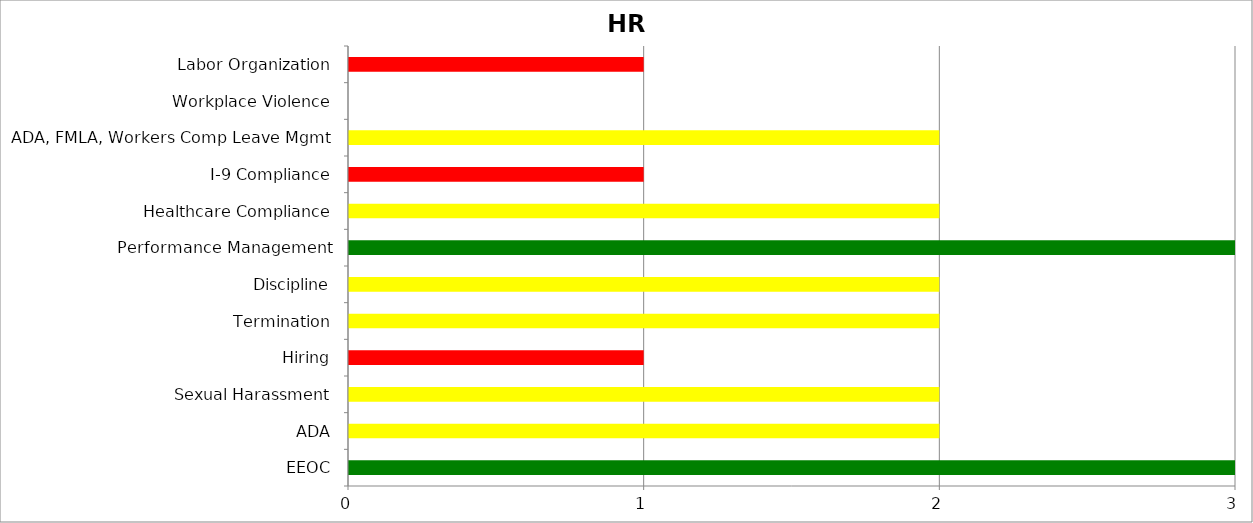
| Category | Low | Medium | High |
|---|---|---|---|
| EEOC | 3 | 0 | 0 |
| ADA | 0 | 2 | 0 |
| Sexual Harassment | 0 | 2 | 0 |
| Hiring | 0 | 0 | 1 |
| Termination | 0 | 2 | 0 |
| Discipline | 0 | 2 | 0 |
| Performance Management | 3 | 0 | 0 |
| Healthcare Compliance | 0 | 2 | 0 |
| I-9 Compliance | 0 | 0 | 1 |
| ADA, FMLA, Workers Comp Leave Mgmt | 0 | 2 | 0 |
| Workplace Violence | 0 | 0 | 0 |
| Labor Organization | 0 | 0 | 1 |